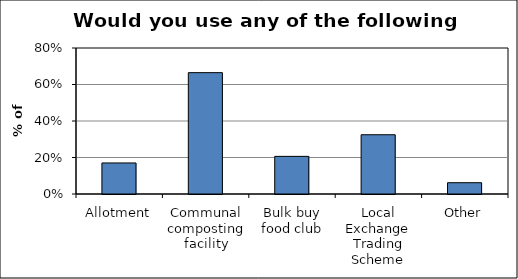
| Category | Series 0 |
|---|---|
| Allotment | 0.17 |
| Communal composting facility | 0.665 |
| Bulk buy food club | 0.206 |
| Local Exchange Trading Scheme | 0.325 |
| Other | 0.062 |